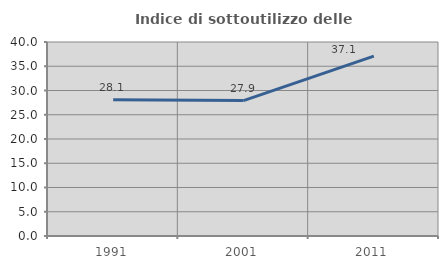
| Category | Indice di sottoutilizzo delle abitazioni  |
|---|---|
| 1991.0 | 28.09 |
| 2001.0 | 27.92 |
| 2011.0 | 37.103 |